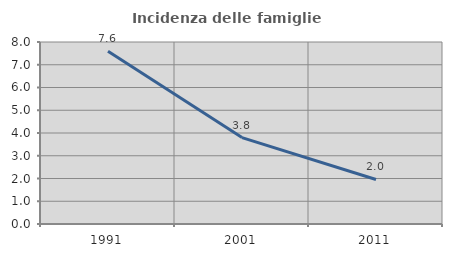
| Category | Incidenza delle famiglie numerose |
|---|---|
| 1991.0 | 7.593 |
| 2001.0 | 3.799 |
| 2011.0 | 1.956 |